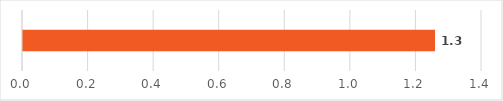
| Category | Сексуално насиље  |
|---|---|
|  | 1.257 |